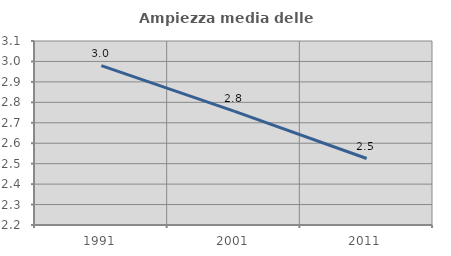
| Category | Ampiezza media delle famiglie |
|---|---|
| 1991.0 | 2.98 |
| 2001.0 | 2.757 |
| 2011.0 | 2.525 |